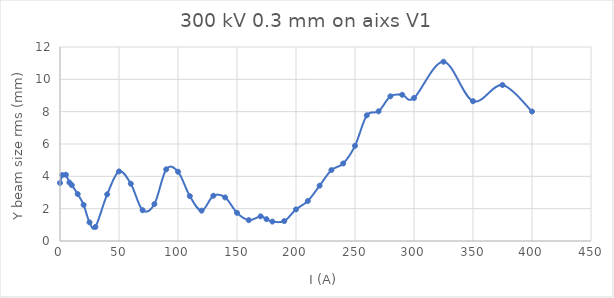
| Category | Series 0 |
|---|---|
| 0.0 | 3.59 |
| 2.0 | 4.081 |
| 5.0 | 4.099 |
| 8.0 | 3.616 |
| 10.0 | 3.458 |
| 15.0 | 2.904 |
| 20.0 | 2.235 |
| 25.0 | 1.153 |
| 30.0 | 0.869 |
| 40.0 | 2.887 |
| 50.0 | 4.302 |
| 60.0 | 3.543 |
| 70.0 | 1.904 |
| 80.0 | 2.285 |
| 90.0 | 4.43 |
| 100.0 | 4.286 |
| 110.0 | 2.779 |
| 120.0 | 1.877 |
| 130.0 | 2.8 |
| 140.0 | 2.694 |
| 150.0 | 1.741 |
| 160.0 | 1.29 |
| 170.0 | 1.526 |
| 175.0 | 1.35 |
| 180.0 | 1.202 |
| 190.0 | 1.232 |
| 200.0 | 1.956 |
| 210.0 | 2.474 |
| 220.0 | 3.423 |
| 230.0 | 4.386 |
| 240.0 | 4.795 |
| 250.0 | 5.886 |
| 260.0 | 7.775 |
| 270.0 | 8.022 |
| 280.0 | 8.949 |
| 290.0 | 9.046 |
| 300.0 | 8.845 |
| 325.0 | 11.09 |
| 350.0 | 8.648 |
| 375.0 | 9.648 |
| 400.0 | 8.01 |